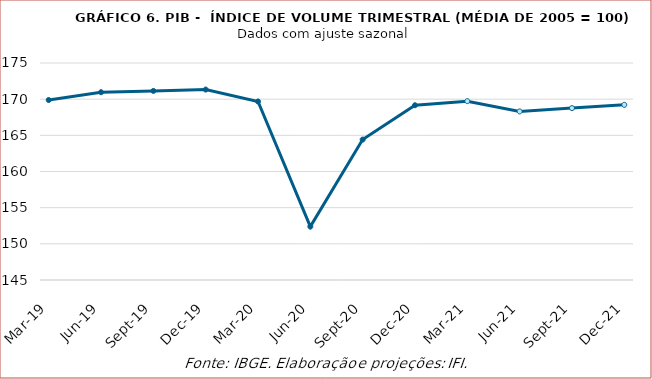
| Category | Series 0 |
|---|---|
| 2019-03-01 | 169.883 |
| 2019-06-01 | 170.961 |
| 2019-09-01 | 171.143 |
| 2019-12-01 | 171.331 |
| 2020-03-01 | 169.679 |
| 2020-06-01 | 152.384 |
| 2020-09-01 | 164.413 |
| 2020-12-01 | 169.158 |
| 2021-03-01 | 169.724 |
| 2021-06-01 | 168.308 |
| 2021-09-01 | 168.763 |
| 2021-12-01 | 169.219 |